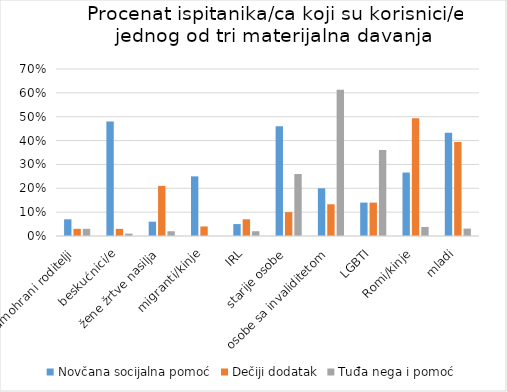
| Category | Novčana socijalna pomoć | Dečiji dodatak | Tuđa nega i pomoć |
|---|---|---|---|
| samohrani roditelji | 0.07 | 0.03 | 0.03 |
| beskućnici/e | 0.48 | 0.03 | 0.01 |
| žene žrtve nasilja | 0.06 | 0.21 | 0.02 |
| migranti/kinje | 0.25 | 0.04 | 0 |
| IRL | 0.05 | 0.07 | 0.02 |
| starije osobe | 0.46 | 0.1 | 0.26 |
| osobe sa invaliditetom | 0.2 | 0.133 | 0.613 |
| LGBTI | 0.14 | 0.14 | 0.36 |
| Romi/kinje | 0.266 | 0.494 | 0.038 |
| mladi | 0.433 | 0.394 | 0.031 |